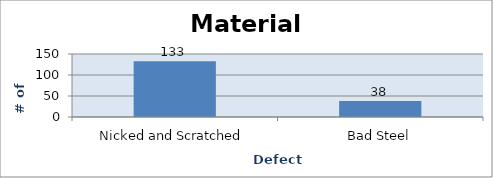
| Category | MATERIALS |
|---|---|
| Nicked and Scratched | 133 |
| Bad Steel | 38 |